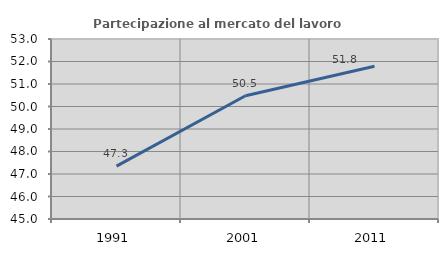
| Category | Partecipazione al mercato del lavoro  femminile |
|---|---|
| 1991.0 | 47.349 |
| 2001.0 | 50.479 |
| 2011.0 | 51.785 |